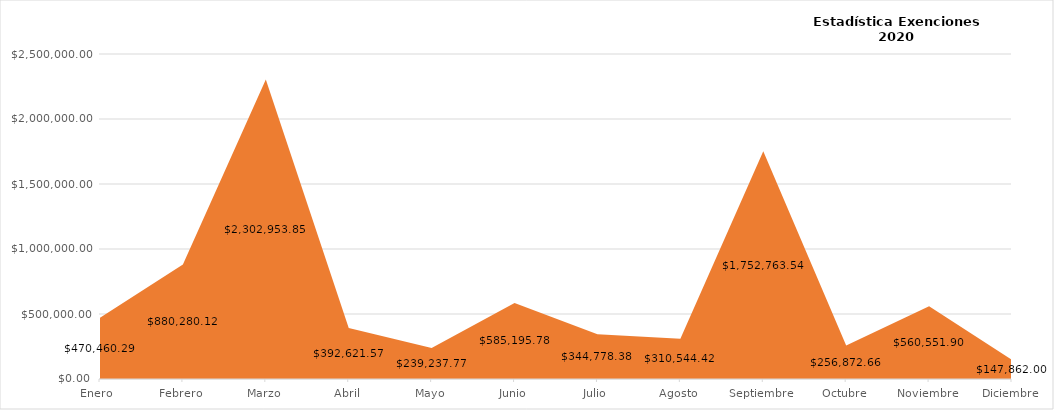
| Category | Total de Monto Condonado |
|---|---|
| Enero  | 470460.29 |
| Febrero | 880280.12 |
| Marzo | 2302953.85 |
| Abril | 392621.57 |
| Mayo | 239237.77 |
| Junio | 585195.78 |
| Julio | 344778.38 |
| Agosto | 310544.42 |
| Septiembre | 1752763.54 |
| Octubre | 256872.66 |
| Noviembre | 560551.9 |
| Diciembre | 147862 |